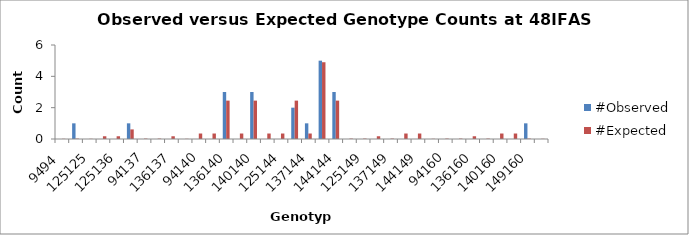
| Category | #Observed | #Expected |
|---|---|---|
| 9494.0 | 0 | 0.012 |
| 94125.0 | 1 | 0.025 |
| 125125.0 | 0 | 0.012 |
| 94136.0 | 0 | 0.175 |
| 125136.0 | 0 | 0.175 |
| 136136.0 | 1 | 0.612 |
| 94137.0 | 0 | 0.025 |
| 125137.0 | 0 | 0.025 |
| 136137.0 | 0 | 0.175 |
| 137137.0 | 0 | 0.012 |
| 94140.0 | 0 | 0.35 |
| 125140.0 | 0 | 0.35 |
| 136140.0 | 3 | 2.45 |
| 137140.0 | 0 | 0.35 |
| 140140.0 | 3 | 2.45 |
| 94144.0 | 0 | 0.35 |
| 125144.0 | 0 | 0.35 |
| 136144.0 | 2 | 2.45 |
| 137144.0 | 1 | 0.35 |
| 140144.0 | 5 | 4.9 |
| 144144.0 | 3 | 2.45 |
| 94149.0 | 0 | 0.025 |
| 125149.0 | 0 | 0.025 |
| 136149.0 | 0 | 0.175 |
| 137149.0 | 0 | 0.025 |
| 140149.0 | 0 | 0.35 |
| 144149.0 | 0 | 0.35 |
| 149149.0 | 0 | 0.012 |
| 94160.0 | 0 | 0.025 |
| 125160.0 | 0 | 0.025 |
| 136160.0 | 0 | 0.175 |
| 137160.0 | 0 | 0.025 |
| 140160.0 | 0 | 0.35 |
| 144160.0 | 0 | 0.35 |
| 149160.0 | 1 | 0.025 |
| 160160.0 | 0 | 0.012 |